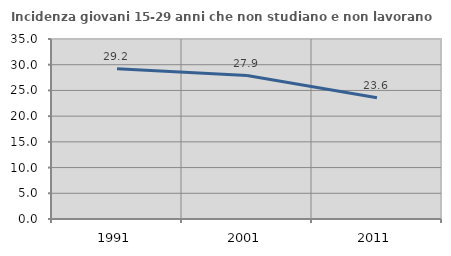
| Category | Incidenza giovani 15-29 anni che non studiano e non lavorano  |
|---|---|
| 1991.0 | 29.217 |
| 2001.0 | 27.884 |
| 2011.0 | 23.574 |